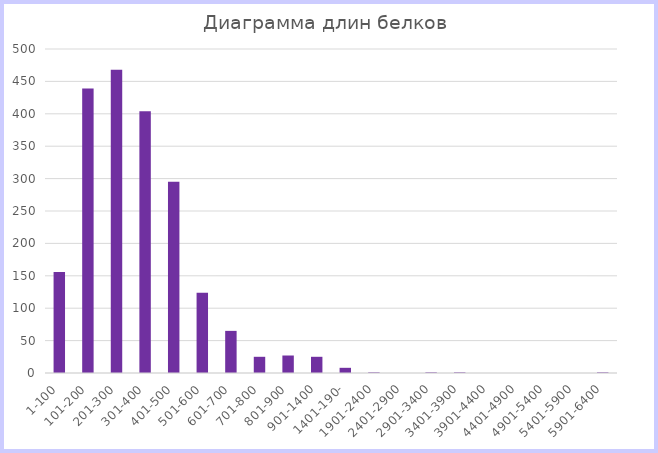
| Category | Series 0 |
|---|---|
| 1-100 | 156 |
| 101-200 | 439 |
| 201-300 | 468 |
| 301-400 | 404 |
| 401-500 | 295 |
| 501-600 | 124 |
| 601-700 | 65 |
| 701-800 | 25 |
| 801-900 | 27 |
| 901-1400 | 25 |
| 1401-190- | 8 |
| 1901-2400 | 1 |
| 2401-2900 | 0 |
| 2901-3400 | 1 |
| 3401-3900 | 1 |
| 3901-4400 | 0 |
| 4401-4900 | 0 |
| 4901-5400 | 0 |
| 5401-5900 | 0 |
| 5901-6400 | 1 |